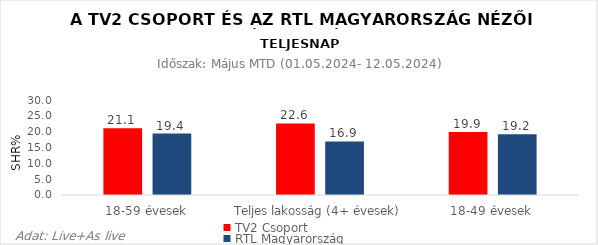
| Category | TV2 Csoport | RTL Magyarország |
|---|---|---|
| 18-59 évesek | 21.1 | 19.4 |
| Teljes lakosság (4+ évesek) | 22.6 | 16.9 |
| 18-49 évesek | 19.9 | 19.2 |